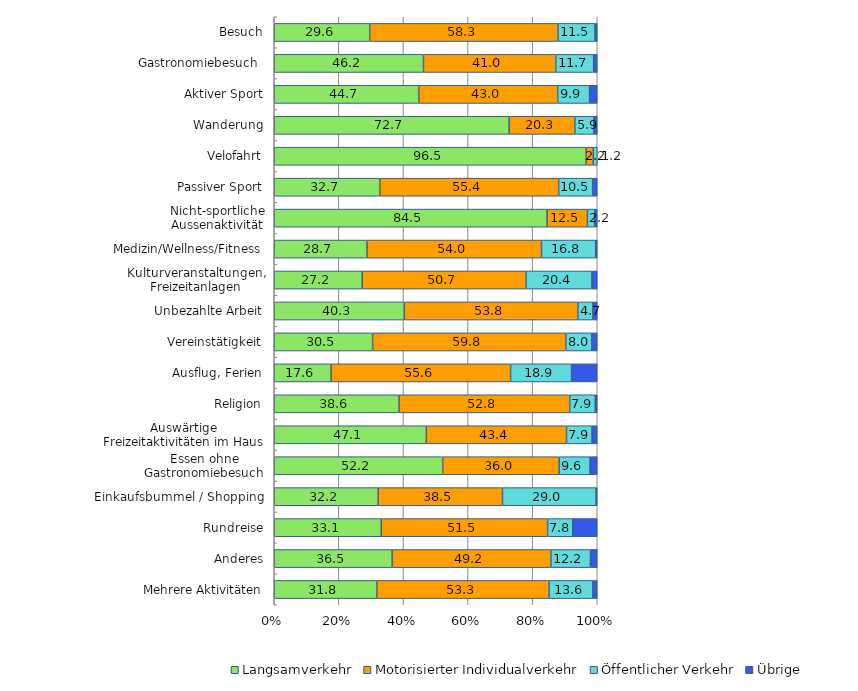
| Category | Langsamverkehr | Motorisierter Individualverkehr | Öffentlicher Verkehr | Übrige |
|---|---|---|---|---|
| Besuch | 29.562 | 58.283 | 11.48 | 0.675 |
| Gastronomiebesuch  | 46.193 | 40.96 | 11.749 | 1.097 |
| Aktiver Sport | 44.746 | 43.014 | 9.868 | 2.372 |
| Wanderung | 72.724 | 20.344 | 5.899 | 1.034 |
| Velofahrt | 96.539 | 2.235 | 1.225 | 0 |
| Passiver Sport | 32.698 | 55.363 | 10.524 | 1.415 |
| Nicht-sportliche Aussenaktivität | 84.482 | 12.476 | 2.226 | 0.816 |
| Medizin/Wellness/Fitness | 28.716 | 54.02 | 16.784 | 0.48 |
| Kulturveranstaltungen, Freizeitanlagen | 27.238 | 50.717 | 20.428 | 1.618 |
| Unbezahlte Arbeit | 40.26 | 53.754 | 4.662 | 1.323 |
| Vereinstätigkeit | 30.45 | 59.831 | 8.047 | 1.671 |
| Ausflug, Ferien | 17.585 | 55.592 | 18.862 | 7.961 |
| Religion | 38.633 | 52.845 | 7.906 | 0.616 |
| Auswärtige Freizeitaktivitäten im Haus | 47.088 | 43.402 | 7.903 | 1.607 |
| Essen ohne Gastronomiebesuch | 52.151 | 36.044 | 9.59 | 2.216 |
| Einkaufsbummel / Shopping | 32.164 | 38.507 | 28.979 | 0.349 |
| Rundreise | 33.138 | 51.486 | 7.781 | 7.595 |
| Anderes | 36.496 | 49.152 | 12.241 | 2.11 |
| Mehrere Aktivitäten | 31.764 | 53.313 | 13.568 | 1.355 |